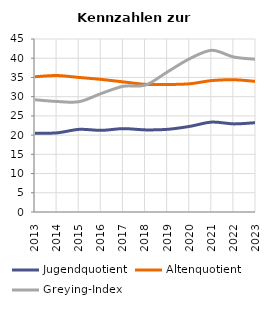
| Category | Jugendquotient | Altenquotient | Greying-Index |
|---|---|---|---|
| 2013.0 | 20.473 | 35.185 | 29.198 |
| 2014.0 | 20.59 | 35.492 | 28.744 |
| 2015.0 | 21.495 | 34.995 | 28.701 |
| 2016.0 | 21.237 | 34.485 | 30.828 |
| 2017.0 | 21.682 | 33.84 | 32.704 |
| 2018.0 | 21.362 | 33.202 | 33.022 |
| 2019.0 | 21.503 | 33.169 | 36.465 |
| 2020.0 | 22.27 | 33.35 | 39.87 |
| 2021.0 | 23.384 | 34.188 | 42.055 |
| 2022.0 | 22.92 | 34.4 | 40.31 |
| 2023.0 | 23.241 | 33.964 | 39.724 |